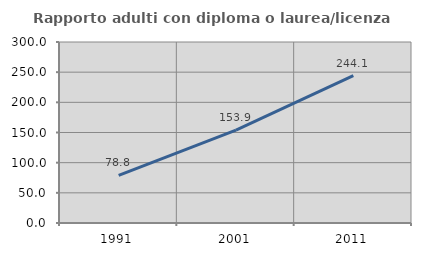
| Category | Rapporto adulti con diploma o laurea/licenza media  |
|---|---|
| 1991.0 | 78.8 |
| 2001.0 | 153.913 |
| 2011.0 | 244.086 |